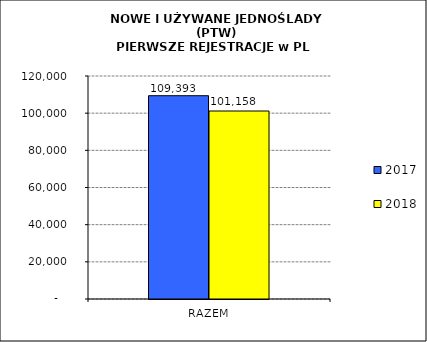
| Category | 2017 | 2018 |
|---|---|---|
| RAZEM | 109393 | 101158 |